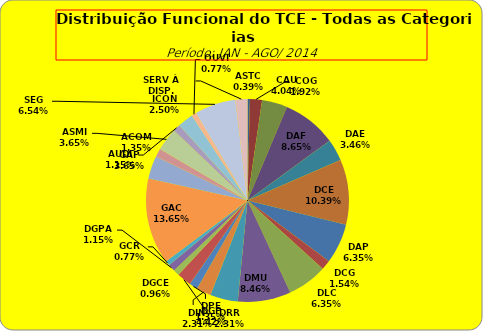
| Category | ASTC COG CAU DAF DAE DCE DAP DCG DLC DMU DGP DIN DPE DRR DGCE DGPA GCR GAC GAP ACOM ASMI AUDI ICON OUVI SEG SERV À DISP. |
|---|---|
| ASTC | 2 |
| COG | 10 |
| CAU | 21 |
| DAF | 45 |
| DAE | 18 |
| DCE | 54 |
| DAP | 33 |
| DCG | 8 |
| DLC | 33 |
| DMU | 44 |
| DGP | 23 |
| DIN | 12 |
| DPE | 7 |
| DRR | 12 |
| DGCE | 5 |
| DGPA | 6 |
| GCR | 4 |
| GAC | 71 |
| GAP | 19 |
| ACOM | 7 |
| ASMI | 19 |
| AUDI | 6 |
| ICON | 13 |
| OUVI | 4 |
| SEG | 34 |
| SERV À DISP. | 10 |